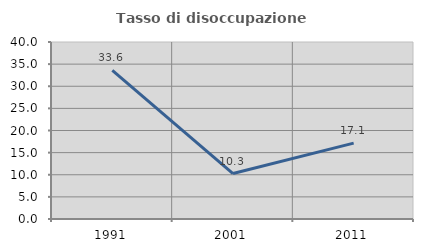
| Category | Tasso di disoccupazione giovanile  |
|---|---|
| 1991.0 | 33.564 |
| 2001.0 | 10.274 |
| 2011.0 | 17.143 |